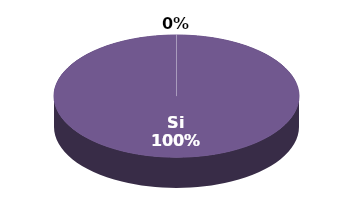
| Category | Series 1 |
|---|---|
| Si | 18 |